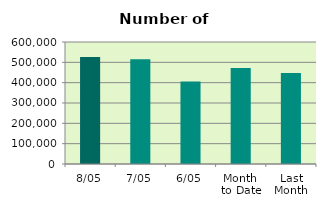
| Category | Series 0 |
|---|---|
| 8/05 | 526254 |
| 7/05 | 514788 |
| 6/05 | 405984 |
| Month 
to Date | 472295.6 |
| Last
Month | 447135.9 |